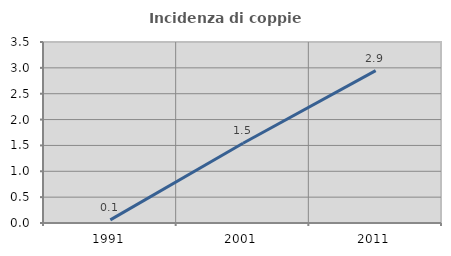
| Category | Incidenza di coppie miste |
|---|---|
| 1991.0 | 0.061 |
| 2001.0 | 1.541 |
| 2011.0 | 2.947 |